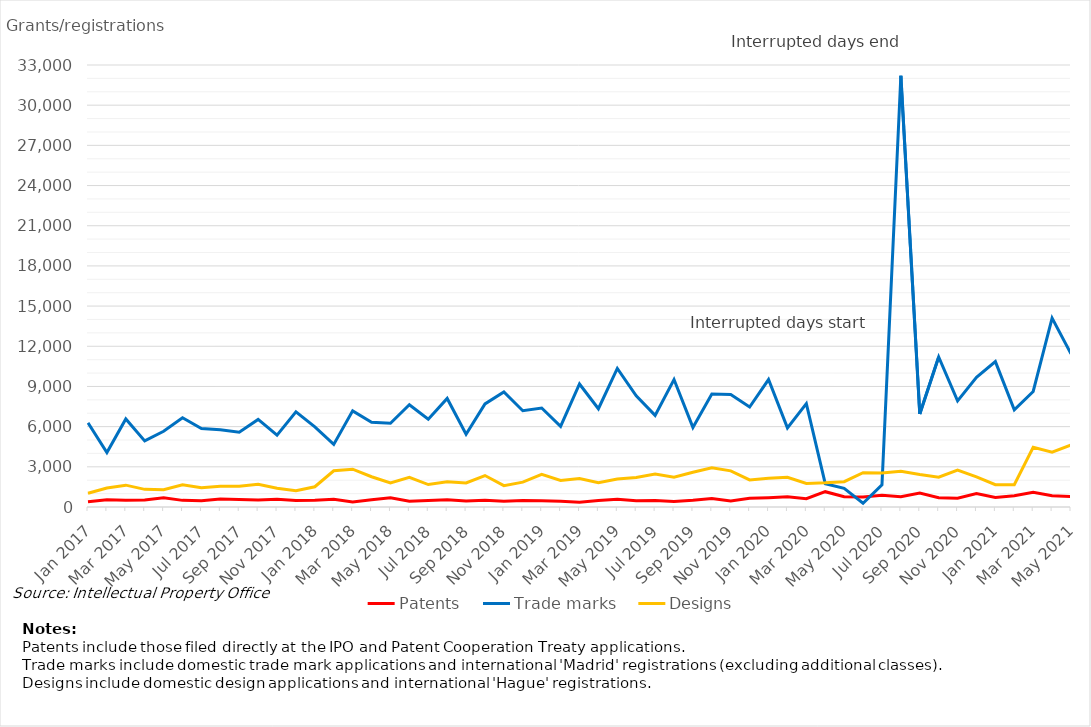
| Category | Patents | Trade marks | Designs |
|---|---|---|---|
| Jan 2017 | 387 | 6288 | 1026 |
| Feb 2017 | 533 | 4063 | 1420 |
| Mar 2017 | 505 | 6576 | 1631 |
| Apr 2017 | 516 | 4937 | 1318 |
| May 2017 | 681 | 5651 | 1284 |
| Jun 2017 | 495 | 6659 | 1660 |
| Jul 2017 | 466 | 5857 | 1437 |
| Aug 2017 | 592 | 5763 | 1550 |
| Sep 2017 | 554 | 5578 | 1553 |
| Oct 2017 | 517 | 6539 | 1705 |
| Nov 2017 | 578 | 5364 | 1397 |
| Dec 2017 | 487 | 7101 | 1218 |
| Jan 2018 | 495 | 5978 | 1512 |
| Feb 2018 | 574 | 4670 | 2704 |
| Mar 2018 | 370 | 7176 | 2825 |
| Apr 2018 | 543 | 6332 | 2259 |
| May 2018 | 690 | 6251 | 1789 |
| Jun 2018 | 424 | 7636 | 2222 |
| Jul 2018 | 486 | 6547 | 1678 |
| Aug 2018 | 536 | 8103 | 1878 |
| Sep 2018 | 450 | 5426 | 1795 |
| Oct 2018 | 498 | 7699 | 2348 |
| Nov 2018 | 432 | 8591 | 1592 |
| Dec 2018 | 484 | 7189 | 1859 |
| Jan 2019 | 475 | 7393 | 2444 |
| Feb 2019 | 426 | 6021 | 1987 |
| Mar 2019 | 363 | 9184 | 2125 |
| Apr 2019 | 488 | 7335 | 1810 |
| May 2019 | 573 | 10345 | 2096 |
| Jun 2019 | 471 | 8304 | 2202 |
| Jul 2019 | 489 | 6839 | 2464 |
| Aug 2019 | 420 | 9515 | 2218 |
| Sep 2019 | 500 | 5942 | 2596 |
| Oct 2019 | 634 | 8436 | 2926 |
| Nov 2019 | 455 | 8398 | 2700 |
| Dec 2019 | 654 | 7465 | 2021 |
| Jan 2020 | 696 | 9517 | 2145 |
| Feb 2020 | 756 | 5905 | 2220 |
| Mar 2020 | 622 | 7719 | 1758 |
| Apr 2020 | 1143 | 1741 | 1803 |
| May 2020 | 768 | 1398 | 1888 |
| Jun 2020 | 740 | 280 | 2564 |
| Jul 2020 | 878 | 1657 | 2539 |
| Aug 2020 | 771 | 32198 | 2665 |
| Sep 2020 | 1042 | 6941 | 2425 |
| Oct 2020 | 697 | 11197 | 2223 |
| Nov 2020 | 649 | 7926 | 2763 |
| Dec 2020 | 1010 | 9680 | 2252 |
| Jan 2021 | 708 | 10856 | 1665 |
| Feb 2021 | 838 | 7254 | 1661 |
| Mar 2021 | 1107 | 8626 | 4453 |
| Apr 2021 | 838 | 14099 | 4098 |
| May 2021 | 788 | 11439 | 4628 |